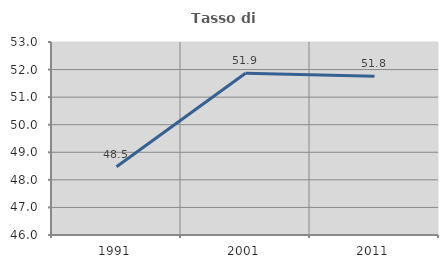
| Category | Tasso di occupazione   |
|---|---|
| 1991.0 | 48.474 |
| 2001.0 | 51.865 |
| 2011.0 | 51.756 |